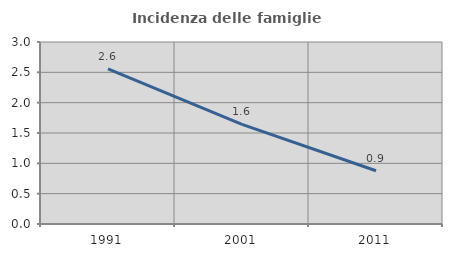
| Category | Incidenza delle famiglie numerose |
|---|---|
| 1991.0 | 2.556 |
| 2001.0 | 1.642 |
| 2011.0 | 0.878 |